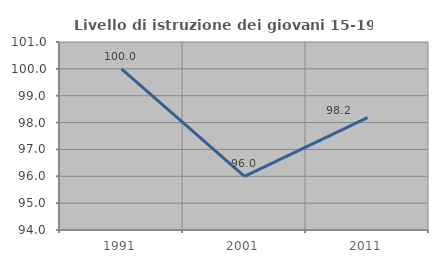
| Category | Livello di istruzione dei giovani 15-19 anni |
|---|---|
| 1991.0 | 100 |
| 2001.0 | 96 |
| 2011.0 | 98.182 |